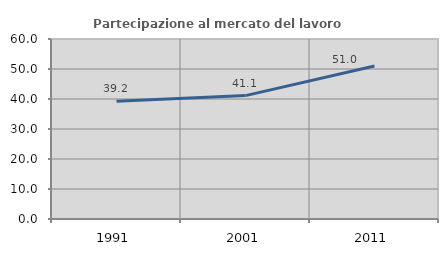
| Category | Partecipazione al mercato del lavoro  femminile |
|---|---|
| 1991.0 | 39.213 |
| 2001.0 | 41.135 |
| 2011.0 | 50.985 |